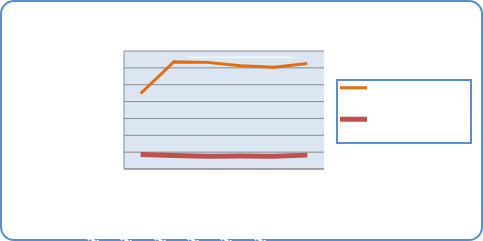
| Category | Motorin Türleri  | Benzin Türleri |
|---|---|---|
| 10/8/18 | 44796980.629 | 8627262.345 |
| 10/9/18 | 63664647.327 | 8036320.755 |
| 10/10/18 | 63252678.784 | 7624377.218 |
| 10/11/18 | 61250857.971 | 7643932.394 |
| 10/12/18 | 60396671.48 | 7551171.439 |
| 10/13/18 | 62593002.151 | 8231401.5 |